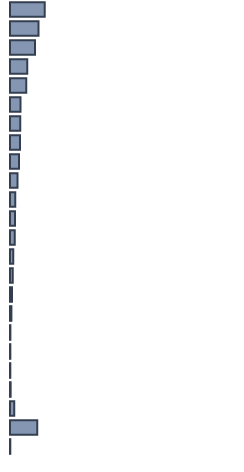
| Category | Series 0 |
|---|---|
| 0 | 15.294 |
| 1 | 12.552 |
| 2 | 11.014 |
| 3 | 7.576 |
| 4 | 7.18 |
| 5 | 4.636 |
| 6 | 4.466 |
| 7 | 4.406 |
| 8 | 3.923 |
| 9 | 3.305 |
| 10 | 2.291 |
| 11 | 2.171 |
| 12 | 2.141 |
| 13 | 1.47 |
| 14 | 1.245 |
| 15 | 0.917 |
| 16 | 0.618 |
| 17 | 0.169 |
| 18 | 0.149 |
| 19 | 0.142 |
| 20 | 0.282 |
| 21 | 1.892 |
| 22 | 12.031 |
| 23 | 0.13 |